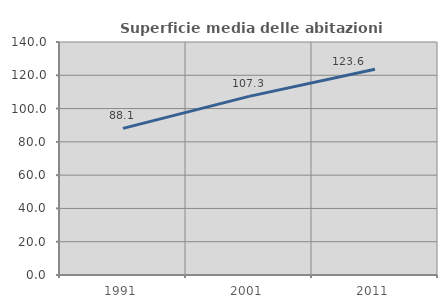
| Category | Superficie media delle abitazioni occupate |
|---|---|
| 1991.0 | 88.093 |
| 2001.0 | 107.333 |
| 2011.0 | 123.575 |